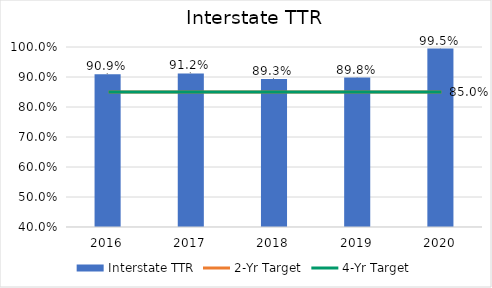
| Category | Interstate TTR |
|---|---|
| 2016.0 | 0.909 |
| 2017.0 | 0.912 |
| 2018.0 | 0.893 |
| 2019.0 | 0.898 |
| 2020.0 | 0.995 |